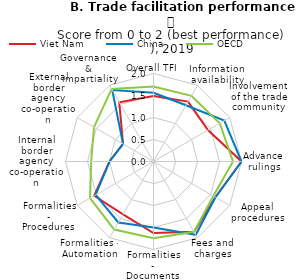
| Category | Viet Nam | China | OECD |
|---|---|---|---|
| Overall TFI | 1.49 | 1.561 | 1.705 |
| Information availability | 1.571 | 1.476 | 1.723 |
| Involvement of the trade community | 1.429 | 1.857 | 1.738 |
| Advance rulings | 2 | 2 | 1.806 |
| Appeal procedures | 1.625 | 1.625 | 1.57 |
| Fees and charges | 1.846 | 1.923 | 1.845 |
| Formalities - Documents | 1.625 | 1.5 | 1.742 |
| Formalities - Automation | 1.385 | 1.6 | 1.785 |
| Formalities - Procedures | 1.556 | 1.519 | 1.666 |
| Internal border agency co-operation | 1 | 1 | 1.417 |
| External border agency co-operation | 0.8 | 0.8 | 1.562 |
| Governance & impartiality | 1.556 | 1.875 | 1.904 |